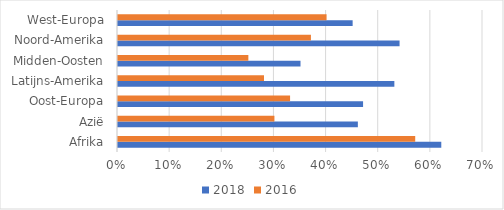
| Category | 2018 | 2016 |
|---|---|---|
| Afrika | 0.62 | 0.57 |
| Azië | 0.46 | 0.3 |
| Oost-Europa | 0.47 | 0.33 |
| Latijns-Amerika | 0.53 | 0.28 |
| Midden-Oosten | 0.35 | 0.25 |
| Noord-Amerika | 0.54 | 0.37 |
| West-Europa | 0.45 | 0.4 |